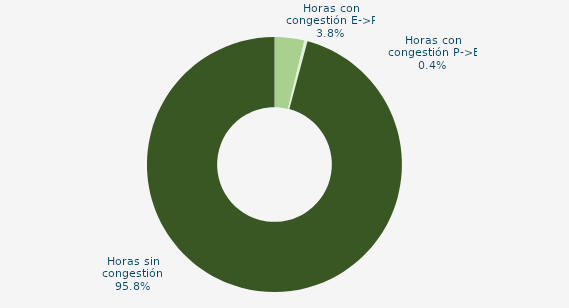
| Category | Horas con congestión E->P |
|---|---|
| Horas con congestión E->P | 3.763 |
| Horas con congestión P->E | 0.403 |
| Horas sin congestión | 95.833 |